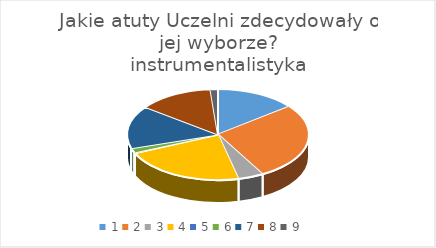
| Category | Series 0 |
|---|---|
| 0 | 54 |
| 1 | 103 |
| 2 | 17 |
| 3 | 82 |
| 4 | 1 |
| 5 | 6 |
| 6 | 57 |
| 7 | 50 |
| 8 | 5 |